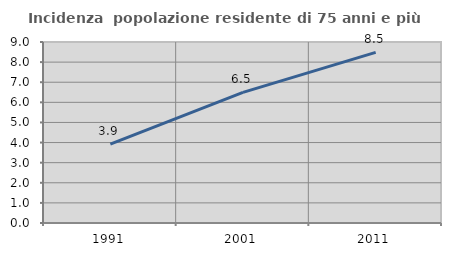
| Category | Incidenza  popolazione residente di 75 anni e più |
|---|---|
| 1991.0 | 3.921 |
| 2001.0 | 6.497 |
| 2011.0 | 8.484 |